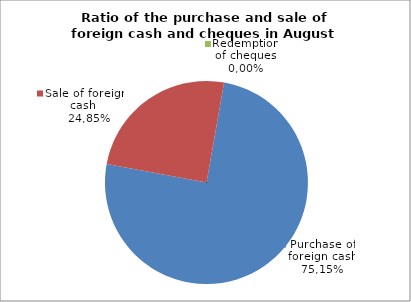
| Category | Purchase of foreign cash |
|---|---|
| 0 | 75.146 |
| 1 | 24.854 |
| 2 | 0 |